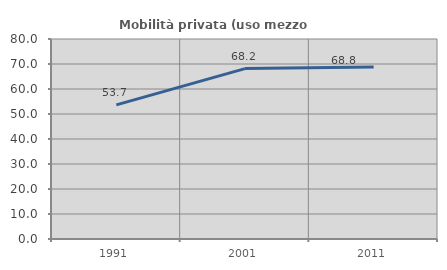
| Category | Mobilità privata (uso mezzo privato) |
|---|---|
| 1991.0 | 53.666 |
| 2001.0 | 68.153 |
| 2011.0 | 68.767 |